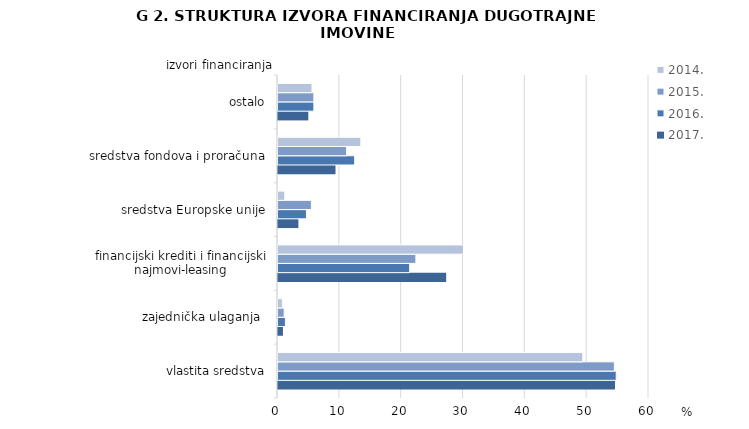
| Category | 2017. | 2016. | 2015. | 2014. |
|---|---|---|---|---|
| vlastita sredstva | 54.5 | 54.7 | 54.4 | 49.3 |
| zajednička ulaganja  | 0.8 | 1.2 | 1 | 0.7 |
| financijski krediti i financijski najmovi-leasing | 27.2 | 21.3 | 22.3 | 30 |
| sredstva Europske unije | 3.3 | 4.6 | 5.4 | 1.1 |
| sredstva fondova i proračuna | 9.3 | 12.4 | 11.1 | 13.4 |
| ostalo | 4.9 | 5.8 | 5.8 | 5.5 |